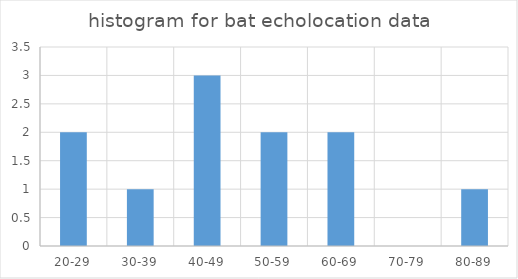
| Category | Series 0 |
|---|---|
| 20-29 | 2 |
| 30-39 | 1 |
| 40-49 | 3 |
| 50-59 | 2 |
| 60-69 | 2 |
| 70-79 | 0 |
| 80-89 | 1 |